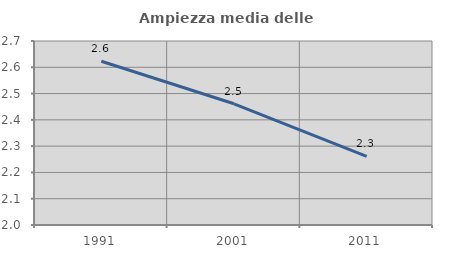
| Category | Ampiezza media delle famiglie |
|---|---|
| 1991.0 | 2.623 |
| 2001.0 | 2.461 |
| 2011.0 | 2.261 |